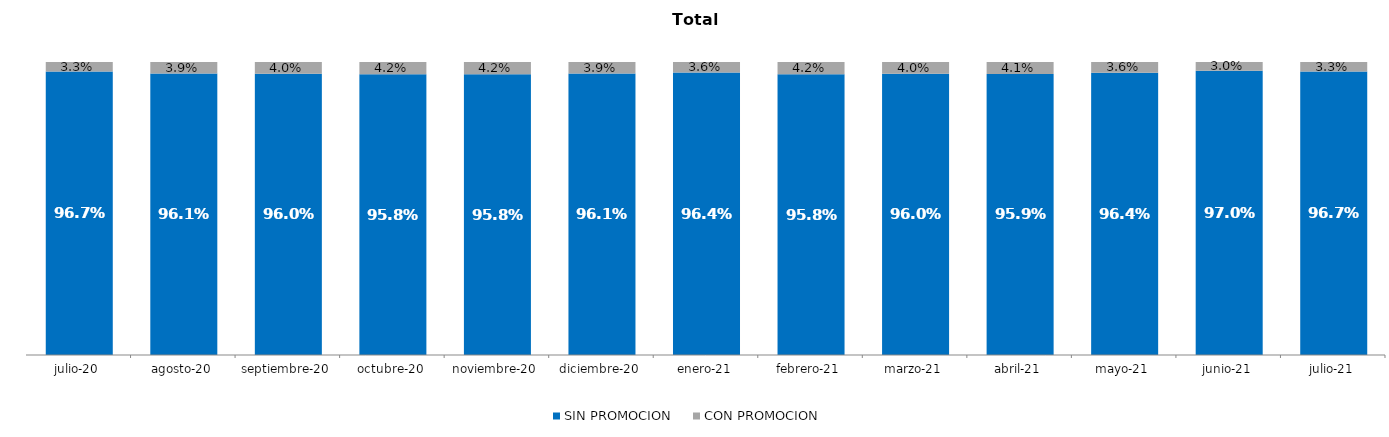
| Category | SIN PROMOCION   | CON PROMOCION   |
|---|---|---|
| 2020-07-01 | 0.967 | 0.033 |
| 2020-08-01 | 0.961 | 0.039 |
| 2020-09-01 | 0.96 | 0.04 |
| 2020-10-01 | 0.958 | 0.042 |
| 2020-11-01 | 0.958 | 0.042 |
| 2020-12-01 | 0.961 | 0.039 |
| 2021-01-01 | 0.964 | 0.036 |
| 2021-02-01 | 0.958 | 0.042 |
| 2021-03-01 | 0.96 | 0.04 |
| 2021-04-01 | 0.959 | 0.041 |
| 2021-05-01 | 0.964 | 0.036 |
| 2021-06-01 | 0.97 | 0.03 |
| 2021-07-01 | 0.967 | 0.033 |